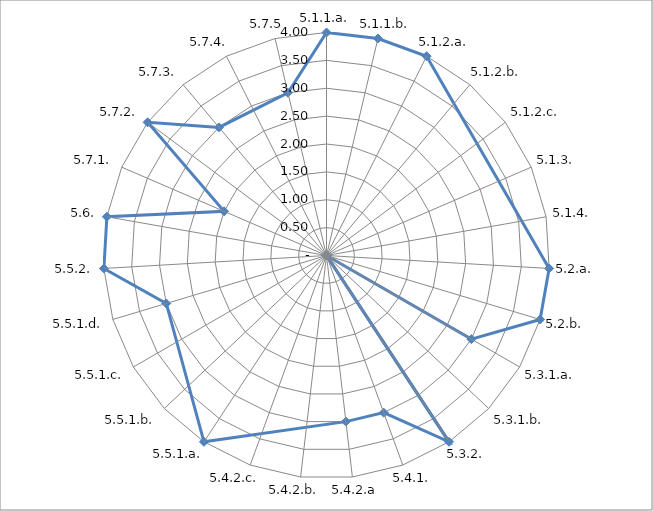
| Category | Series 0 |
|---|---|
| 5.1.1.a. | 4 |
| 5.1.1.b. | 4 |
| 5.1.2.a. | 4 |
| 5.1.2.b. | 0 |
| 5.1.2.c. | 0 |
| 5.1.3. | 0 |
| 5.1.4. | 0 |
| 5.2.a. | 4 |
| 5.2.b. | 4 |
| 5.3.1.a. | 3 |
| 5.3.1.b. | 0 |
| 5.3.2. | 4 |
| 5.4.1. | 3 |
| 5.4.2.a | 3 |
| 5.4.2.b. | 0 |
| 5.4.2.c. | 0 |
| 5.5.1.a. | 4 |
| 5.5.1.b. | 0 |
| 5.5.1.c. | 0 |
| 5.5.1.d. | 3 |
| 5.5.2. | 4 |
| 5.6. | 4 |
| 5.7.1. | 2 |
| 5.7.2. | 4 |
| 5.7.3. | 3 |
| 5.7.4. | 0 |
| 5.7.5 | 3 |